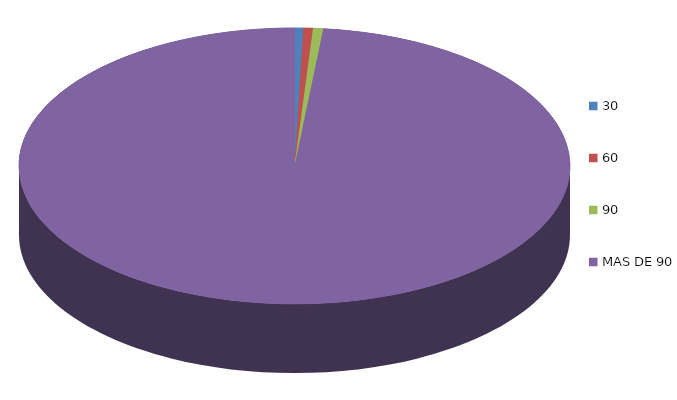
| Category | Series 0 | 209,791.8 227,890.5 245,997.2 40,277,932.6 |
|---|---|---|
| 30 | 209791.8 |  |
| 60 | 227890.5 |  |
| 90 | 245997.2 |  |
| MAS DE 90 | 40277932.6 |  |